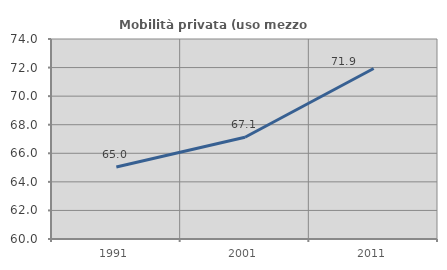
| Category | Mobilità privata (uso mezzo privato) |
|---|---|
| 1991.0 | 65.045 |
| 2001.0 | 67.125 |
| 2011.0 | 71.934 |